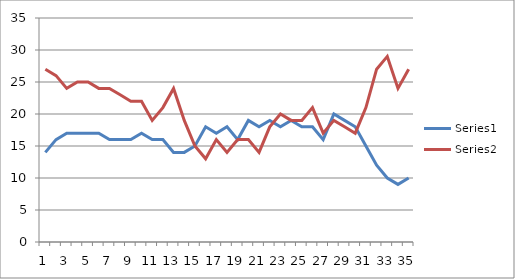
| Category | Series 0 | Series 1 |
|---|---|---|
| 0 | 14 | 27 |
| 1 | 16 | 26 |
| 2 | 17 | 24 |
| 3 | 17 | 25 |
| 4 | 17 | 25 |
| 5 | 17 | 24 |
| 6 | 16 | 24 |
| 7 | 16 | 23 |
| 8 | 16 | 22 |
| 9 | 17 | 22 |
| 10 | 16 | 19 |
| 11 | 16 | 21 |
| 12 | 14 | 24 |
| 13 | 14 | 19 |
| 14 | 15 | 15 |
| 15 | 18 | 13 |
| 16 | 17 | 16 |
| 17 | 18 | 14 |
| 18 | 16 | 16 |
| 19 | 19 | 16 |
| 20 | 18 | 14 |
| 21 | 19 | 18 |
| 22 | 18 | 20 |
| 23 | 19 | 19 |
| 24 | 18 | 19 |
| 25 | 18 | 21 |
| 26 | 16 | 17 |
| 27 | 20 | 19 |
| 28 | 19 | 18 |
| 29 | 18 | 17 |
| 30 | 15 | 21 |
| 31 | 12 | 27 |
| 32 | 10 | 29 |
| 33 | 9 | 24 |
| 34 | 10 | 27 |